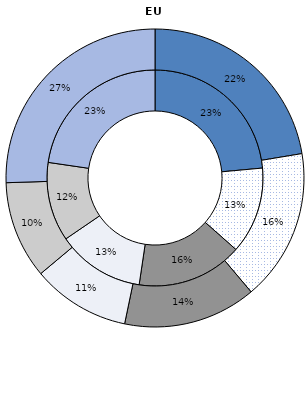
| Category | 2006 | Series 1 |
|---|---|---|
| Germany | 10431 | 12738 |
| United Kingdom | 5757 | 9369 |
| France | 7017.207 | 8210.1 |
| Italy | 5814 | 6053.96 |
| Spain | 5249.993 | 6025.094 |
| Other countries | 10056.177 | 14513.749 |